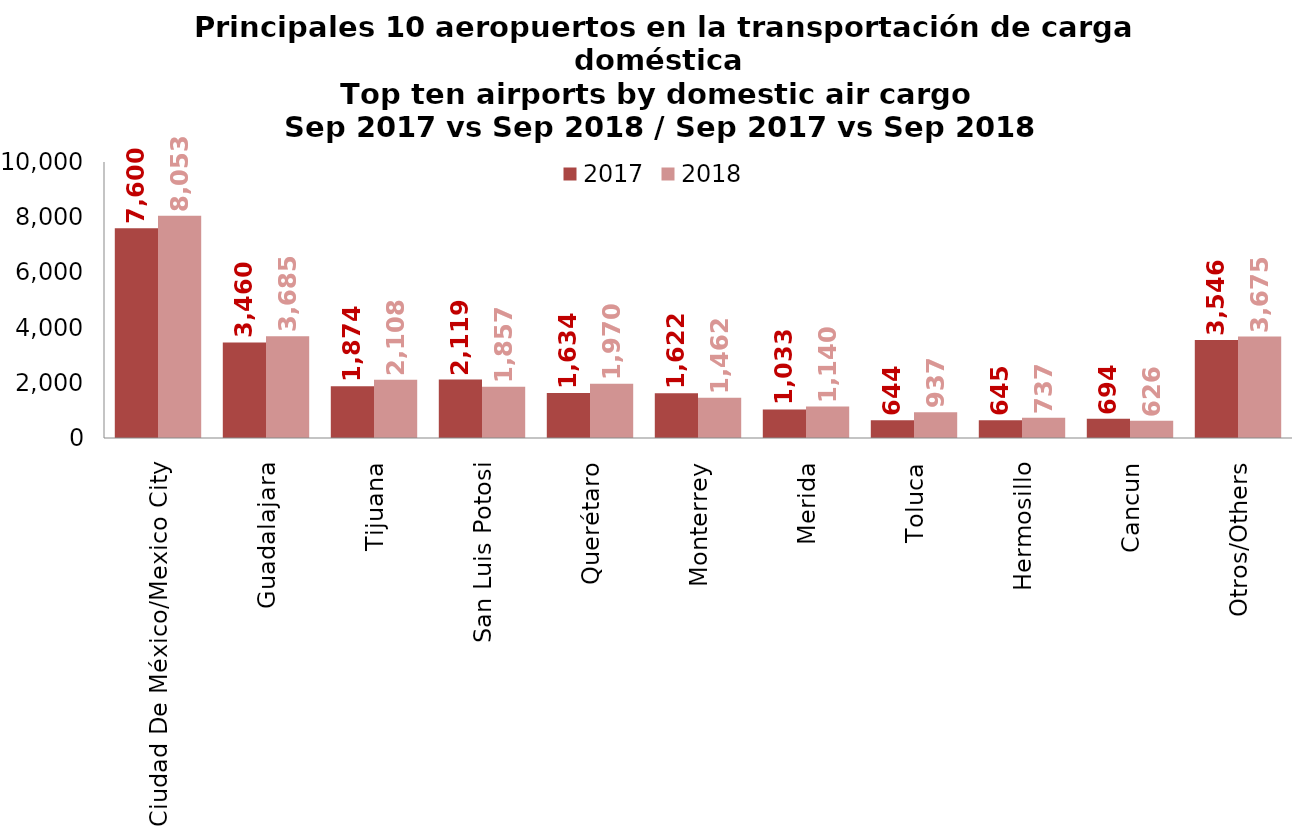
| Category | 2017 | 2018 |
|---|---|---|
| Ciudad De México/Mexico City | 7600.13 | 8052.93 |
| Guadalajara | 3460.287 | 3685.143 |
| Tijuana | 1874.168 | 2108.249 |
| San Luis Potosi | 2119.069 | 1856.888 |
| Querétaro | 1634.148 | 1969.594 |
| Monterrey | 1621.756 | 1462.251 |
| Merida | 1032.815 | 1139.968 |
| Toluca | 643.992 | 937.01 |
| Hermosillo | 645.206 | 737.314 |
| Cancun | 693.599 | 625.714 |
| Otros/Others | 3546.399 | 3674.591 |